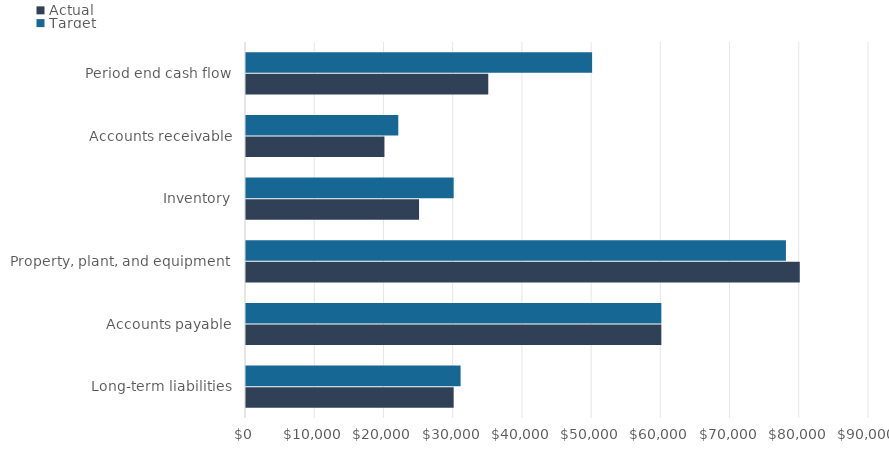
| Category | Actual | Target |
|---|---|---|
| Long-term liabilities | 30000 | 31000 |
| Accounts payable | 60000 | 60000 |
| Property, plant, and equipment | 80000 | 78000 |
| Inventory | 25000 | 30000 |
| Accounts receivable | 20000 | 22000 |
| Period end cash flow | 35000 | 50000 |